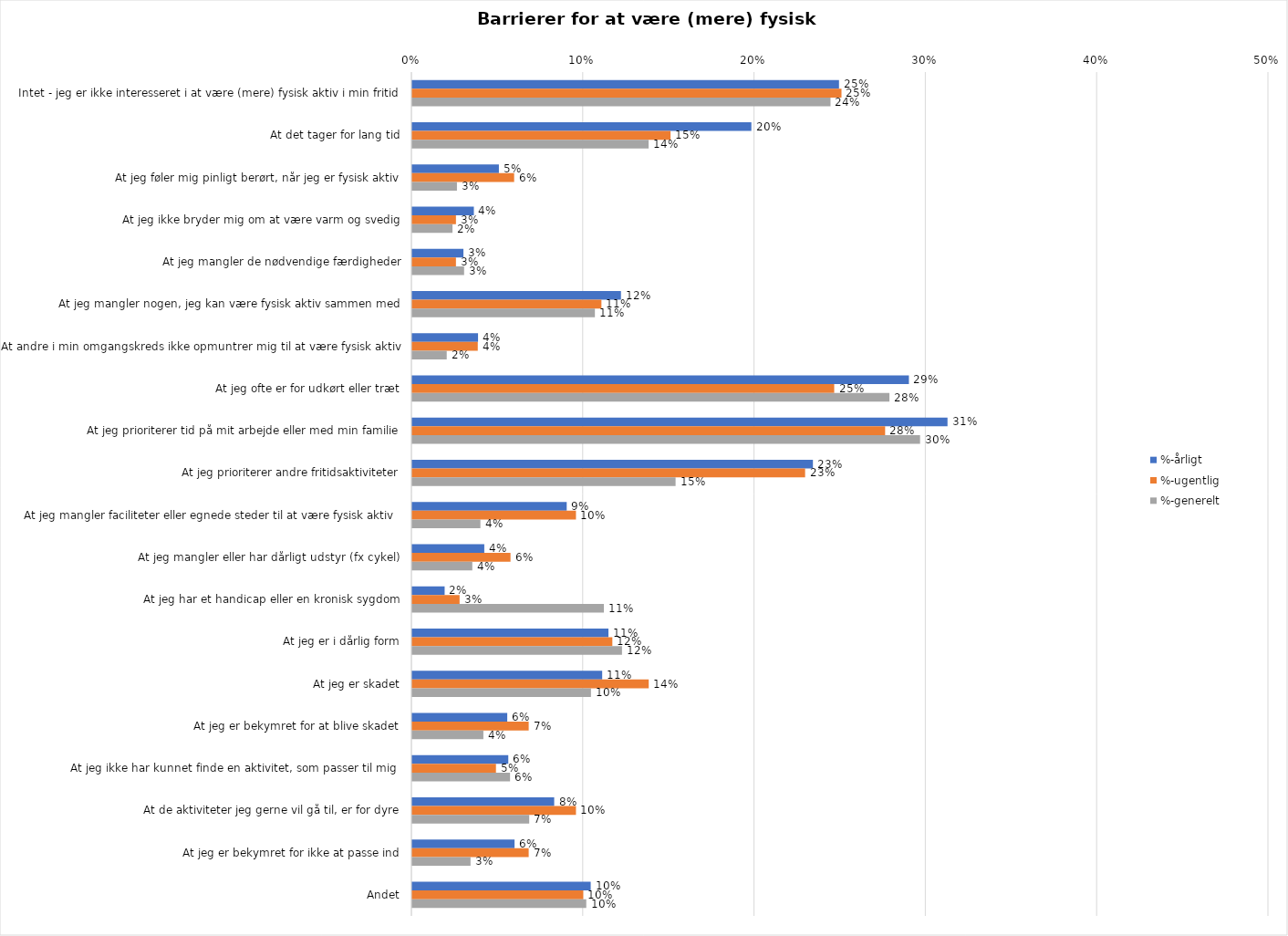
| Category | %-årligt | %-ugentlig | %-generelt |
|---|---|---|---|
| Intet - jeg er ikke interesseret i at være (mere) fysisk aktiv i min fritid | 0.249 | 0.251 | 0.244 |
| At det tager for lang tid | 0.198 | 0.151 | 0.138 |
| At jeg føler mig pinligt berørt, når jeg er fysisk aktiv | 0.051 | 0.059 | 0.026 |
| At jeg ikke bryder mig om at være varm og svedig | 0.036 | 0.025 | 0.023 |
| At jeg mangler de nødvendige færdigheder | 0.03 | 0.025 | 0.03 |
| At jeg mangler nogen, jeg kan være fysisk aktiv sammen med | 0.122 | 0.11 | 0.107 |
| At andre i min omgangskreds ikke opmuntrer mig til at være fysisk aktiv | 0.038 | 0.038 | 0.02 |
| At jeg ofte er for udkørt eller træt | 0.29 | 0.246 | 0.279 |
| At jeg prioriterer tid på mit arbejde eller med min familie | 0.312 | 0.276 | 0.296 |
| At jeg prioriterer andre fritidsaktiviteter | 0.234 | 0.229 | 0.154 |
| At jeg mangler faciliteter eller egnede steder til at være fysisk aktiv  | 0.09 | 0.096 | 0.04 |
| At jeg mangler eller har dårligt udstyr (fx cykel) | 0.042 | 0.057 | 0.035 |
| At jeg har et handicap eller en kronisk sygdom | 0.019 | 0.028 | 0.112 |
| At jeg er i dårlig form | 0.114 | 0.117 | 0.122 |
| At jeg er skadet | 0.111 | 0.138 | 0.104 |
| At jeg er bekymret for at blive skadet | 0.055 | 0.068 | 0.041 |
| At jeg ikke har kunnet finde en aktivitet, som passer til mig  | 0.056 | 0.049 | 0.057 |
| At de aktiviteter jeg gerne vil gå til, er for dyre | 0.083 | 0.096 | 0.068 |
| At jeg er bekymret for ikke at passe ind | 0.06 | 0.068 | 0.034 |
| Andet | 0.104 | 0.1 | 0.102 |